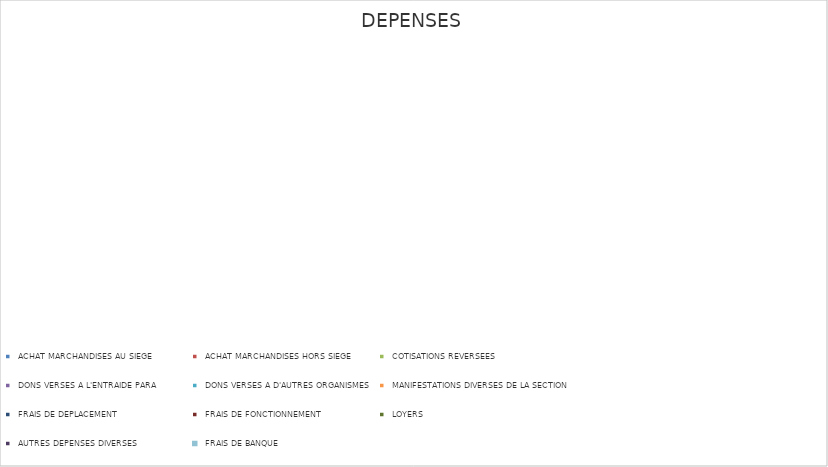
| Category | Series 0 |
|---|---|
|  ACHAT MARCHANDISES AU SIEGE  | 0 |
|  ACHAT MARCHANDISES HORS SIEGE  | 0 |
|  COTISATIONS REVERSEES  | 0 |
|  DONS VERSES A L'ENTRAIDE PARA  | 0 |
|  DONS VERSES A D'AUTRES ORGANISMES  | 0 |
|  MANIFESTATIONS DIVERSES DE LA SECTION  | 0 |
|  FRAIS DE DEPLACEMENT  | 0 |
|  FRAIS DE FONCTIONNEMENT  | 0 |
|  LOYERS  | 0 |
|  AUTRES DEPENSES DIVERSES  | 0 |
|  FRAIS DE BANQUE  | 0 |